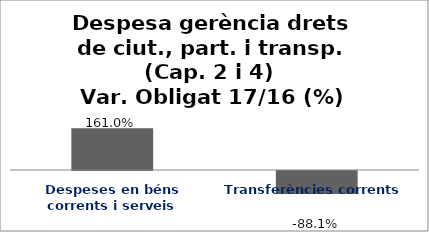
| Category | Series 0 |
|---|---|
| Despeses en béns corrents i serveis | 1.61 |
| Transferències corrents | -0.881 |